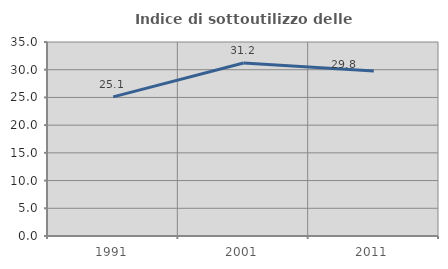
| Category | Indice di sottoutilizzo delle abitazioni  |
|---|---|
| 1991.0 | 25.106 |
| 2001.0 | 31.198 |
| 2011.0 | 29.752 |